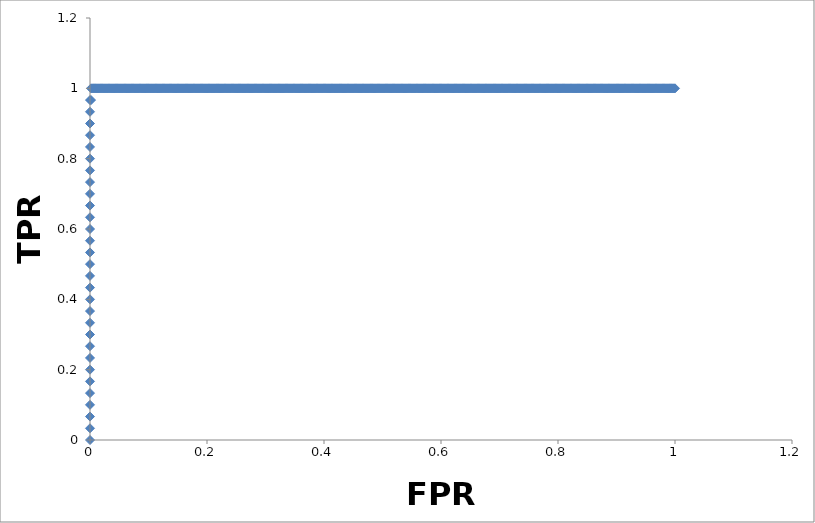
| Category | Series 0 |
|---|---|
| 0.0 | 0 |
| 0.0 | 0.033 |
| 0.0 | 0.067 |
| 0.0 | 0.1 |
| 0.0 | 0.133 |
| 0.0 | 0.167 |
| 0.0 | 0.2 |
| 0.0 | 0.233 |
| 0.0 | 0.267 |
| 0.0 | 0.3 |
| 0.0 | 0.333 |
| 0.0 | 0.367 |
| 0.0 | 0.4 |
| 0.0 | 0.433 |
| 0.0 | 0.467 |
| 0.0 | 0.5 |
| 0.0 | 0.533 |
| 0.0 | 0.567 |
| 0.0 | 0.6 |
| 0.0 | 0.633 |
| 0.0 | 0.667 |
| 0.0 | 0.7 |
| 0.0 | 0.733 |
| 0.0 | 0.767 |
| 0.0 | 0.8 |
| 0.0 | 0.833 |
| 0.0 | 0.867 |
| 0.0 | 0.9 |
| 0.0 | 0.933 |
| 0.0 | 0.967 |
| 0.0017667844522968323 | 0.967 |
| 0.0017667844522968323 | 1 |
| 0.0035335689045936647 | 1 |
| 0.005300353356890497 | 1 |
| 0.007067137809187329 | 1 |
| 0.00883392226148405 | 1 |
| 0.010600706713780883 | 1 |
| 0.012367491166077715 | 1 |
| 0.014134275618374548 | 1 |
| 0.01590106007067138 | 1 |
| 0.017667844522968212 | 1 |
| 0.019434628975265045 | 1 |
| 0.021201413427561877 | 1 |
| 0.02296819787985871 | 1 |
| 0.02473498233215543 | 1 |
| 0.026501766784452263 | 1 |
| 0.028268551236749095 | 1 |
| 0.030035335689045928 | 1 |
| 0.03180212014134276 | 1 |
| 0.03356890459363959 | 1 |
| 0.035335689045936425 | 1 |
| 0.03710247349823326 | 1 |
| 0.03886925795053009 | 1 |
| 0.04063604240282681 | 1 |
| 0.04240282685512364 | 1 |
| 0.044169611307420475 | 1 |
| 0.04593639575971731 | 1 |
| 0.04770318021201414 | 1 |
| 0.04946996466431097 | 1 |
| 0.051236749116607805 | 1 |
| 0.05300353356890464 | 1 |
| 0.05477031802120136 | 1 |
| 0.05653710247349819 | 1 |
| 0.05830388692579502 | 1 |
| 0.060070671378091856 | 1 |
| 0.06183745583038869 | 1 |
| 0.06360424028268552 | 1 |
| 0.06537102473498235 | 1 |
| 0.06713780918727918 | 1 |
| 0.06890459363957602 | 1 |
| 0.07067137809187274 | 1 |
| 0.07243816254416957 | 1 |
| 0.0742049469964664 | 1 |
| 0.07597173144876324 | 1 |
| 0.07773851590106007 | 1 |
| 0.0795053003533569 | 1 |
| 0.08127208480565373 | 1 |
| 0.08303886925795056 | 1 |
| 0.0848056537102474 | 1 |
| 0.08657243816254412 | 1 |
| 0.08833922261484095 | 1 |
| 0.09010600706713778 | 1 |
| 0.09187279151943462 | 1 |
| 0.09363957597173145 | 1 |
| 0.09540636042402828 | 1 |
| 0.09717314487632511 | 1 |
| 0.09893992932862195 | 1 |
| 0.10070671378091878 | 1 |
| 0.1024734982332155 | 1 |
| 0.10424028268551233 | 1 |
| 0.10600706713780916 | 1 |
| 0.107773851590106 | 1 |
| 0.10954063604240283 | 1 |
| 0.11130742049469966 | 1 |
| 0.11307420494699649 | 1 |
| 0.11484098939929333 | 1 |
| 0.11660777385159016 | 1 |
| 0.11837455830388688 | 1 |
| 0.12014134275618371 | 1 |
| 0.12190812720848054 | 1 |
| 0.12367491166077738 | 1 |
| 0.1254416961130742 | 1 |
| 0.12720848056537104 | 1 |
| 0.12897526501766787 | 1 |
| 0.1307420494699647 | 1 |
| 0.13250883392226154 | 1 |
| 0.13427561837455826 | 1 |
| 0.1360424028268551 | 1 |
| 0.13780918727915192 | 1 |
| 0.13957597173144876 | 1 |
| 0.1413427561837456 | 1 |
| 0.14310954063604242 | 1 |
| 0.14487632508833925 | 1 |
| 0.14664310954063609 | 1 |
| 0.14840989399293292 | 1 |
| 0.15017667844522964 | 1 |
| 0.15194346289752647 | 1 |
| 0.1537102473498233 | 1 |
| 0.15547703180212014 | 1 |
| 0.15724381625441697 | 1 |
| 0.1590106007067138 | 1 |
| 0.16077738515901063 | 1 |
| 0.16254416961130747 | 1 |
| 0.1643109540636042 | 1 |
| 0.16607773851590102 | 1 |
| 0.16784452296819785 | 1 |
| 0.16961130742049468 | 1 |
| 0.17137809187279152 | 1 |
| 0.17314487632508835 | 1 |
| 0.17491166077738518 | 1 |
| 0.176678445229682 | 1 |
| 0.17844522968197885 | 1 |
| 0.18021201413427557 | 1 |
| 0.1819787985865724 | 1 |
| 0.18374558303886923 | 1 |
| 0.18551236749116606 | 1 |
| 0.1872791519434629 | 1 |
| 0.18904593639575973 | 1 |
| 0.19081272084805656 | 1 |
| 0.1925795053003534 | 1 |
| 0.19434628975265023 | 1 |
| 0.19611307420494695 | 1 |
| 0.19787985865724378 | 1 |
| 0.1996466431095406 | 1 |
| 0.20141342756183744 | 1 |
| 0.20318021201413428 | 1 |
| 0.2049469964664311 | 1 |
| 0.20671378091872794 | 1 |
| 0.20848056537102477 | 1 |
| 0.2102473498233216 | 1 |
| 0.21201413427561833 | 1 |
| 0.21378091872791516 | 1 |
| 0.215547703180212 | 1 |
| 0.21731448763250882 | 1 |
| 0.21908127208480566 | 1 |
| 0.2208480565371025 | 1 |
| 0.22261484098939932 | 1 |
| 0.22438162544169615 | 1 |
| 0.22614840989399299 | 1 |
| 0.2279151943462897 | 1 |
| 0.22968197879858654 | 1 |
| 0.23144876325088337 | 1 |
| 0.2332155477031802 | 1 |
| 0.23498233215547704 | 1 |
| 0.23674911660777387 | 1 |
| 0.2385159010600707 | 1 |
| 0.24028268551236753 | 1 |
| 0.24204946996466437 | 1 |
| 0.2438162544169611 | 1 |
| 0.24558303886925792 | 1 |
| 0.24734982332155475 | 1 |
| 0.24911660777385158 | 1 |
| 0.2508833922261484 | 1 |
| 0.25265017667844525 | 1 |
| 0.2544169611307421 | 1 |
| 0.2561837455830389 | 1 |
| 0.25795053003533563 | 1 |
| 0.25971731448763247 | 1 |
| 0.2614840989399293 | 1 |
| 0.26325088339222613 | 1 |
| 0.26501766784452296 | 1 |
| 0.2667844522968198 | 1 |
| 0.26855123674911663 | 1 |
| 0.27031802120141346 | 1 |
| 0.2720848056537103 | 1 |
| 0.273851590106007 | 1 |
| 0.27561837455830385 | 1 |
| 0.2773851590106007 | 1 |
| 0.2791519434628975 | 1 |
| 0.28091872791519434 | 1 |
| 0.2826855123674912 | 1 |
| 0.284452296819788 | 1 |
| 0.28621908127208484 | 1 |
| 0.2879858657243817 | 1 |
| 0.2897526501766784 | 1 |
| 0.2915194346289752 | 1 |
| 0.29328621908127206 | 1 |
| 0.2950530035335689 | 1 |
| 0.2968197879858657 | 1 |
| 0.29858657243816256 | 1 |
| 0.3003533568904594 | 1 |
| 0.3021201413427562 | 1 |
| 0.30388692579505305 | 1 |
| 0.3056537102473498 | 1 |
| 0.3074204946996466 | 1 |
| 0.30918727915194344 | 1 |
| 0.31095406360424027 | 1 |
| 0.3127208480565371 | 1 |
| 0.31448763250883394 | 1 |
| 0.31625441696113077 | 1 |
| 0.3180212014134276 | 1 |
| 0.31978798586572443 | 1 |
| 0.32155477031802115 | 1 |
| 0.323321554770318 | 1 |
| 0.3250883392226148 | 1 |
| 0.32685512367491165 | 1 |
| 0.3286219081272085 | 1 |
| 0.3303886925795053 | 1 |
| 0.33215547703180215 | 1 |
| 0.333922261484099 | 1 |
| 0.3356890459363958 | 1 |
| 0.33745583038869253 | 1 |
| 0.33922261484098937 | 1 |
| 0.3409893992932862 | 1 |
| 0.34275618374558303 | 1 |
| 0.34452296819787986 | 1 |
| 0.3462897526501767 | 1 |
| 0.34805653710247353 | 1 |
| 0.34982332155477036 | 1 |
| 0.3515901060070671 | 1 |
| 0.3533568904593639 | 1 |
| 0.35512367491166075 | 1 |
| 0.3568904593639576 | 1 |
| 0.3586572438162544 | 1 |
| 0.36042402826855124 | 1 |
| 0.3621908127208481 | 1 |
| 0.3639575971731449 | 1 |
| 0.36572438162544174 | 1 |
| 0.36749116607773846 | 1 |
| 0.3692579505300353 | 1 |
| 0.3710247349823321 | 1 |
| 0.37279151943462896 | 1 |
| 0.3745583038869258 | 1 |
| 0.3763250883392226 | 1 |
| 0.37809187279151946 | 1 |
| 0.3798586572438163 | 1 |
| 0.3816254416961131 | 1 |
| 0.38339222614840984 | 1 |
| 0.3851590106007067 | 1 |
| 0.3869257950530035 | 1 |
| 0.38869257950530034 | 1 |
| 0.39045936395759717 | 1 |
| 0.392226148409894 | 1 |
| 0.39399293286219084 | 1 |
| 0.39575971731448767 | 1 |
| 0.3975265017667845 | 1 |
| 0.3992932862190812 | 1 |
| 0.40106007067137805 | 1 |
| 0.4028268551236749 | 1 |
| 0.4045936395759717 | 1 |
| 0.40636042402826855 | 1 |
| 0.4081272084805654 | 1 |
| 0.4098939929328622 | 1 |
| 0.41166077738515905 | 1 |
| 0.4134275618374559 | 1 |
| 0.4151943462897526 | 1 |
| 0.41696113074204944 | 1 |
| 0.41872791519434627 | 1 |
| 0.4204946996466431 | 1 |
| 0.42226148409893993 | 1 |
| 0.42402826855123676 | 1 |
| 0.4257950530035336 | 1 |
| 0.42756183745583043 | 1 |
| 0.42932862190812726 | 1 |
| 0.431095406360424 | 1 |
| 0.4328621908127208 | 1 |
| 0.43462897526501765 | 1 |
| 0.4363957597173145 | 1 |
| 0.4381625441696113 | 1 |
| 0.43992932862190814 | 1 |
| 0.441696113074205 | 1 |
| 0.4434628975265018 | 1 |
| 0.44522968197879864 | 1 |
| 0.44699646643109536 | 1 |
| 0.4487632508833922 | 1 |
| 0.450530035335689 | 1 |
| 0.45229681978798586 | 1 |
| 0.4540636042402827 | 1 |
| 0.4558303886925795 | 1 |
| 0.45759717314487636 | 1 |
| 0.4593639575971732 | 1 |
| 0.4611307420494699 | 1 |
| 0.46289752650176674 | 1 |
| 0.4646643109540636 | 1 |
| 0.4664310954063604 | 1 |
| 0.46819787985865724 | 1 |
| 0.46996466431095407 | 1 |
| 0.4717314487632509 | 1 |
| 0.47349823321554774 | 1 |
| 0.47526501766784457 | 1 |
| 0.4770318021201413 | 1 |
| 0.4787985865724381 | 1 |
| 0.48056537102473496 | 1 |
| 0.4823321554770318 | 1 |
| 0.4840989399293286 | 1 |
| 0.48586572438162545 | 1 |
| 0.4876325088339223 | 1 |
| 0.4893992932862191 | 1 |
| 0.49116607773851595 | 1 |
| 0.49293286219081267 | 1 |
| 0.4946996466431095 | 1 |
| 0.49646643109540634 | 1 |
| 0.49823321554770317 | 1 |
| 0.5 | 1 |
| 0.5017667844522968 | 1 |
| 0.5035335689045937 | 1 |
| 0.5053003533568905 | 1 |
| 0.5070671378091873 | 1 |
| 0.5088339222614842 | 1 |
| 0.510600706713781 | 1 |
| 0.5123674911660777 | 1 |
| 0.5141342756183745 | 1 |
| 0.5159010600706714 | 1 |
| 0.5176678445229682 | 1 |
| 0.519434628975265 | 1 |
| 0.5212014134275618 | 1 |
| 0.5229681978798586 | 1 |
| 0.5247349823321554 | 1 |
| 0.5265017667844523 | 1 |
| 0.5282685512367491 | 1 |
| 0.5300353356890459 | 1 |
| 0.5318021201413428 | 1 |
| 0.5335689045936396 | 1 |
| 0.5353356890459364 | 1 |
| 0.5371024734982333 | 1 |
| 0.5388692579505301 | 1 |
| 0.5406360424028269 | 1 |
| 0.5424028268551238 | 1 |
| 0.5441696113074205 | 1 |
| 0.5459363957597173 | 1 |
| 0.5477031802120141 | 1 |
| 0.549469964664311 | 1 |
| 0.5512367491166077 | 1 |
| 0.5530035335689045 | 1 |
| 0.5547703180212014 | 1 |
| 0.5565371024734982 | 1 |
| 0.558303886925795 | 1 |
| 0.5600706713780919 | 1 |
| 0.5618374558303887 | 1 |
| 0.5636042402826855 | 1 |
| 0.5653710247349824 | 1 |
| 0.5671378091872792 | 1 |
| 0.568904593639576 | 1 |
| 0.5706713780918728 | 1 |
| 0.5724381625441697 | 1 |
| 0.5742049469964665 | 1 |
| 0.5759717314487632 | 1 |
| 0.5777385159010601 | 1 |
| 0.5795053003533569 | 1 |
| 0.5812720848056537 | 1 |
| 0.5830388692579505 | 1 |
| 0.5848056537102473 | 1 |
| 0.5865724381625441 | 1 |
| 0.588339222614841 | 1 |
| 0.5901060070671378 | 1 |
| 0.5918727915194346 | 1 |
| 0.5936395759717314 | 1 |
| 0.5954063604240283 | 1 |
| 0.5971731448763251 | 1 |
| 0.598939929328622 | 1 |
| 0.6007067137809188 | 1 |
| 0.6024734982332156 | 1 |
| 0.6042402826855124 | 1 |
| 0.6060070671378092 | 1 |
| 0.607773851590106 | 1 |
| 0.6095406360424028 | 1 |
| 0.6113074204946997 | 1 |
| 0.6130742049469965 | 1 |
| 0.6148409893992932 | 1 |
| 0.61660777385159 | 1 |
| 0.6183745583038869 | 1 |
| 0.6201413427561837 | 1 |
| 0.6219081272084805 | 1 |
| 0.6236749116607774 | 1 |
| 0.6254416961130742 | 1 |
| 0.627208480565371 | 1 |
| 0.6289752650176679 | 1 |
| 0.6307420494699647 | 1 |
| 0.6325088339222615 | 1 |
| 0.6342756183745584 | 1 |
| 0.6360424028268552 | 1 |
| 0.6378091872791519 | 1 |
| 0.6395759717314488 | 1 |
| 0.6413427561837456 | 1 |
| 0.6431095406360424 | 1 |
| 0.6448763250883391 | 1 |
| 0.646643109540636 | 1 |
| 0.6484098939929328 | 1 |
| 0.6501766784452296 | 1 |
| 0.6519434628975265 | 1 |
| 0.6537102473498233 | 1 |
| 0.6554770318021201 | 1 |
| 0.657243816254417 | 1 |
| 0.6590106007067138 | 1 |
| 0.6607773851590106 | 1 |
| 0.6625441696113075 | 1 |
| 0.6643109540636043 | 1 |
| 0.6660777385159011 | 1 |
| 0.667844522968198 | 1 |
| 0.6696113074204947 | 1 |
| 0.6713780918727915 | 1 |
| 0.6731448763250883 | 1 |
| 0.6749116607773852 | 1 |
| 0.6766784452296819 | 1 |
| 0.6784452296819787 | 1 |
| 0.6802120141342756 | 1 |
| 0.6819787985865724 | 1 |
| 0.6837455830388692 | 1 |
| 0.6855123674911661 | 1 |
| 0.6872791519434629 | 1 |
| 0.6890459363957597 | 1 |
| 0.6908127208480566 | 1 |
| 0.6925795053003534 | 1 |
| 0.6943462897526502 | 1 |
| 0.6961130742049471 | 1 |
| 0.6978798586572439 | 1 |
| 0.6996466431095406 | 1 |
| 0.7014134275618374 | 1 |
| 0.7031802120141343 | 1 |
| 0.7049469964664311 | 1 |
| 0.7067137809187279 | 1 |
| 0.7084805653710247 | 1 |
| 0.7102473498233215 | 1 |
| 0.7120141342756183 | 1 |
| 0.7137809187279152 | 1 |
| 0.715547703180212 | 1 |
| 0.7173144876325088 | 1 |
| 0.7190812720848057 | 1 |
| 0.7208480565371025 | 1 |
| 0.7226148409893993 | 1 |
| 0.7243816254416962 | 1 |
| 0.726148409893993 | 1 |
| 0.7279151943462898 | 1 |
| 0.7296819787985867 | 1 |
| 0.7314487632508834 | 1 |
| 0.7332155477031802 | 1 |
| 0.734982332155477 | 1 |
| 0.7367491166077739 | 1 |
| 0.7385159010600706 | 1 |
| 0.7402826855123674 | 1 |
| 0.7420494699646643 | 1 |
| 0.7438162544169611 | 1 |
| 0.7455830388692579 | 1 |
| 0.7473498233215548 | 1 |
| 0.7491166077738516 | 1 |
| 0.7508833922261484 | 1 |
| 0.7526501766784452 | 1 |
| 0.7544169611307421 | 1 |
| 0.7561837455830389 | 1 |
| 0.7579505300353357 | 1 |
| 0.7597173144876326 | 1 |
| 0.7614840989399293 | 1 |
| 0.7632508833922261 | 1 |
| 0.765017667844523 | 1 |
| 0.7667844522968198 | 1 |
| 0.7685512367491166 | 1 |
| 0.7703180212014135 | 1 |
| 0.7720848056537102 | 1 |
| 0.773851590106007 | 1 |
| 0.7756183745583038 | 1 |
| 0.7773851590106007 | 1 |
| 0.7791519434628975 | 1 |
| 0.7809187279151943 | 1 |
| 0.7826855123674912 | 1 |
| 0.784452296819788 | 1 |
| 0.7862190812720848 | 1 |
| 0.7879858657243817 | 1 |
| 0.7897526501766785 | 1 |
| 0.7915194346289752 | 1 |
| 0.7932862190812721 | 1 |
| 0.7950530035335689 | 1 |
| 0.7968197879858657 | 1 |
| 0.7985865724381626 | 1 |
| 0.8003533568904594 | 1 |
| 0.8021201413427562 | 1 |
| 0.8038869257950529 | 1 |
| 0.8056537102473498 | 1 |
| 0.8074204946996466 | 1 |
| 0.8091872791519434 | 1 |
| 0.8109540636042403 | 1 |
| 0.8127208480565371 | 1 |
| 0.8144876325088339 | 1 |
| 0.8162544169611308 | 1 |
| 0.8180212014134276 | 1 |
| 0.8197879858657244 | 1 |
| 0.8215547703180213 | 1 |
| 0.823321554770318 | 1 |
| 0.8250883392226148 | 1 |
| 0.8268551236749117 | 1 |
| 0.8286219081272085 | 1 |
| 0.8303886925795053 | 1 |
| 0.8321554770318021 | 1 |
| 0.833922261484099 | 1 |
| 0.8356890459363957 | 1 |
| 0.8374558303886925 | 1 |
| 0.8392226148409894 | 1 |
| 0.8409893992932862 | 1 |
| 0.842756183745583 | 1 |
| 0.8445229681978799 | 1 |
| 0.8462897526501767 | 1 |
| 0.8480565371024735 | 1 |
| 0.8498233215547704 | 1 |
| 0.8515901060070672 | 1 |
| 0.853356890459364 | 1 |
| 0.8551236749116607 | 1 |
| 0.8568904593639576 | 1 |
| 0.8586572438162544 | 1 |
| 0.8604240282685512 | 1 |
| 0.8621908127208481 | 1 |
| 0.8639575971731449 | 1 |
| 0.8657243816254416 | 1 |
| 0.8674911660777385 | 1 |
| 0.8692579505300353 | 1 |
| 0.8710247349823321 | 1 |
| 0.872791519434629 | 1 |
| 0.8745583038869258 | 1 |
| 0.8763250883392226 | 1 |
| 0.8780918727915195 | 1 |
| 0.8798586572438163 | 1 |
| 0.8816254416961131 | 1 |
| 0.88339222614841 | 1 |
| 0.8851590106007067 | 1 |
| 0.8869257950530035 | 1 |
| 0.8886925795053003 | 1 |
| 0.8904593639575972 | 1 |
| 0.892226148409894 | 1 |
| 0.8939929328621908 | 1 |
| 0.8957597173144877 | 1 |
| 0.8975265017667844 | 1 |
| 0.8992932862190812 | 1 |
| 0.901060070671378 | 1 |
| 0.9028268551236749 | 1 |
| 0.9045936395759717 | 1 |
| 0.9063604240282686 | 1 |
| 0.9081272084805654 | 1 |
| 0.9098939929328622 | 1 |
| 0.911660777385159 | 1 |
| 0.9134275618374559 | 1 |
| 0.9151943462897526 | 1 |
| 0.9169611307420494 | 1 |
| 0.9187279151943463 | 1 |
| 0.9204946996466431 | 1 |
| 0.9222614840989399 | 1 |
| 0.9240282685512368 | 1 |
| 0.9257950530035336 | 1 |
| 0.9275618374558304 | 1 |
| 0.9293286219081272 | 1 |
| 0.931095406360424 | 1 |
| 0.9328621908127208 | 1 |
| 0.9346289752650176 | 1 |
| 0.9363957597173145 | 1 |
| 0.9381625441696113 | 1 |
| 0.9399293286219081 | 1 |
| 0.941696113074205 | 1 |
| 0.9434628975265018 | 1 |
| 0.9452296819787986 | 1 |
| 0.9469964664310954 | 1 |
| 0.9487632508833922 | 1 |
| 0.950530035335689 | 1 |
| 0.9522968197879859 | 1 |
| 0.9540636042402827 | 1 |
| 0.9558303886925795 | 1 |
| 0.9575971731448764 | 1 |
| 0.9593639575971732 | 1 |
| 0.9611307420494699 | 1 |
| 0.9628975265017667 | 1 |
| 0.9646643109540636 | 1 |
| 0.9664310954063604 | 1 |
| 0.9681978798586572 | 1 |
| 0.9699646643109541 | 1 |
| 0.9717314487632509 | 1 |
| 0.9734982332155477 | 1 |
| 0.9752650176678446 | 1 |
| 0.9770318021201413 | 1 |
| 0.9787985865724381 | 1 |
| 0.980565371024735 | 1 |
| 0.9823321554770318 | 1 |
| 0.9840989399293286 | 1 |
| 0.9858657243816255 | 1 |
| 0.9876325088339223 | 1 |
| 0.9893992932862191 | 1 |
| 0.991166077738516 | 1 |
| 0.9929328621908127 | 1 |
| 0.9946996466431095 | 1 |
| 0.9964664310954063 | 1 |
| 0.9982332155477032 | 1 |
| 1.0 | 1 |